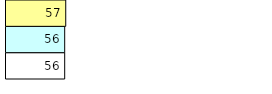
| Category | Total Standouts | Total Recd | Total Tipsters |
|---|---|---|---|
| 0 | 56 | 56 | 57 |